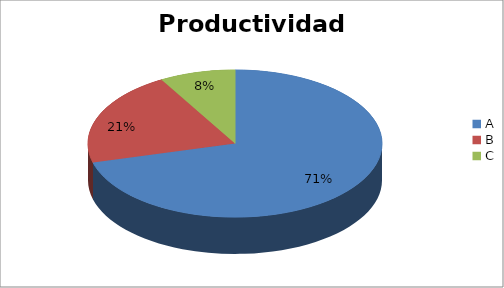
| Category | Series 0 |
|---|---|
| A | 70.833 |
| B | 20.833 |
| C | 8.333 |